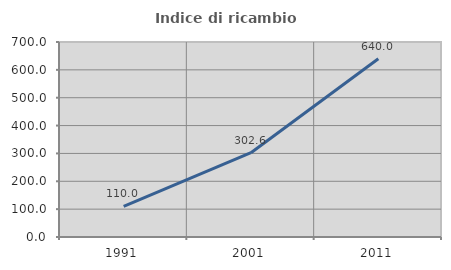
| Category | Indice di ricambio occupazionale  |
|---|---|
| 1991.0 | 110 |
| 2001.0 | 302.564 |
| 2011.0 | 640 |